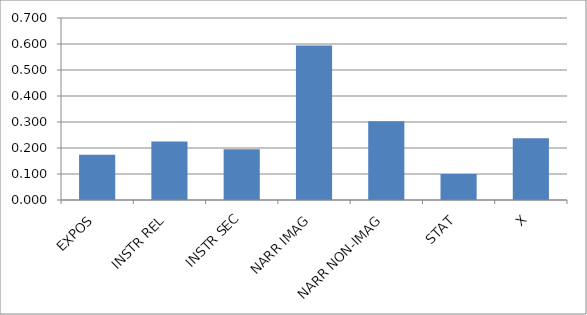
| Category | Series 0 |
|---|---|
| EXPOS | 0.174 |
| INSTR REL | 0.225 |
| INSTR SEC | 0.195 |
| NARR IMAG | 0.594 |
| NARR NON-IMAG | 0.303 |
| STAT | 0.1 |
| X | 0.238 |